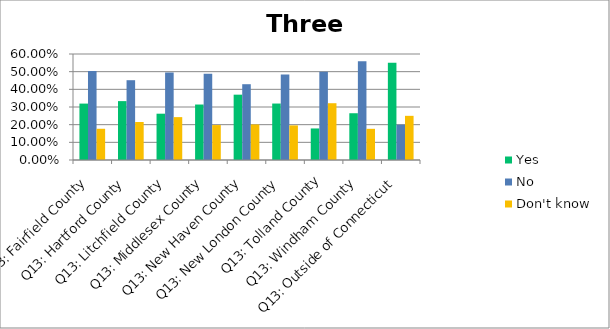
| Category | Yes | No | Don't know |
|---|---|---|---|
| Q13: Fairfield County | 0.319 | 0.504 | 0.177 |
| Q13: Hartford County | 0.333 | 0.452 | 0.215 |
| Q13: Litchfield County | 0.262 | 0.495 | 0.243 |
| Q13: Middlesex County | 0.314 | 0.488 | 0.198 |
| Q13: New Haven County | 0.37 | 0.429 | 0.201 |
| Q13: New London County | 0.32 | 0.484 | 0.196 |
| Q13: Tolland County | 0.179 | 0.5 | 0.321 |
| Q13: Windham County | 0.265 | 0.559 | 0.176 |
| Q13: Outside of Connecticut | 0.55 | 0.2 | 0.25 |